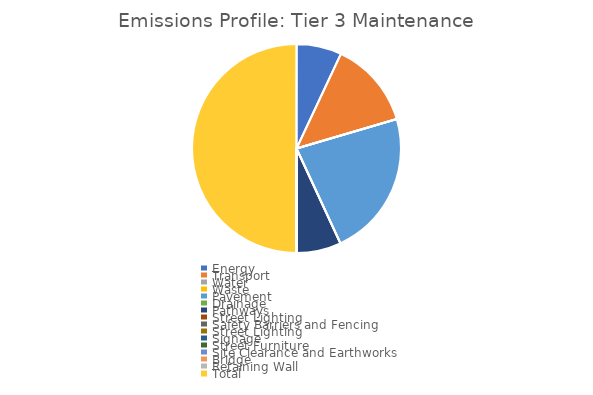
| Category | kgCO₂e |
|---|---|
| Energy | 5119802.339 |
| Transport | 9873311.828 |
| Water | 0 |
| Waste | 0 |
| Pavement | 16598928.747 |
| Drainage | 0 |
| Pathways | 5067254.881 |
| Street Lighting | 0 |
| Safety Barriers and Fencing | 0 |
| Street Lighting  | 0 |
| Signage | 0 |
| Street Furniture | 0 |
| Site Clearance and Earthworks | 0 |
| Bridge | 0 |
| Retaining Wall | 0 |
| Total | 36659297.795 |